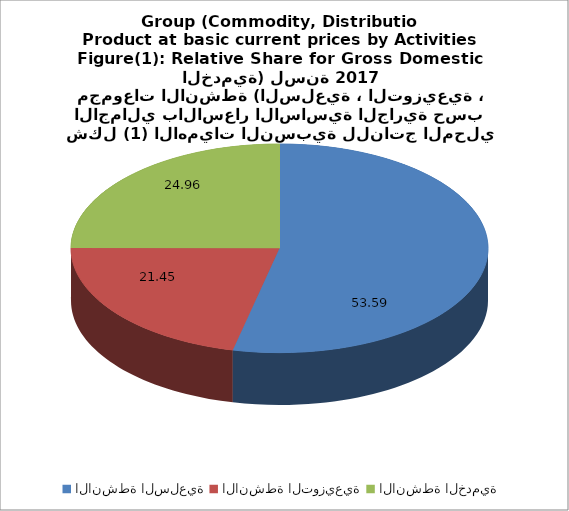
| Category | Series 0 |
|---|---|
| الانشطة السلعية | 53.59 |
| الانشطة التوزيعية | 21.45 |
| الانشطة الخدمية | 24.96 |